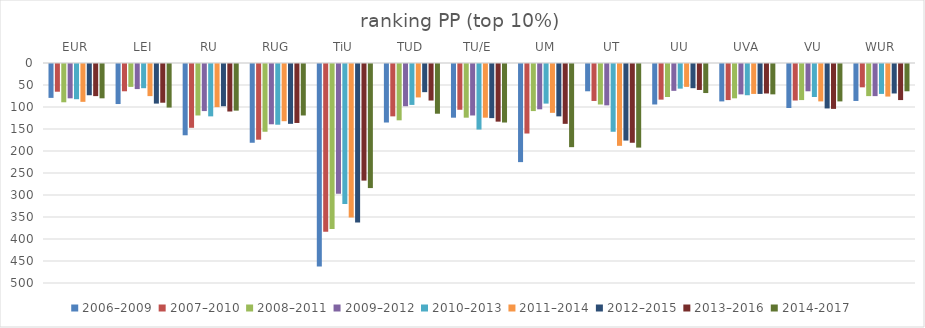
| Category | 2006–2009 | 2007–2010 | 2008–2011 | 2009–2012 | 2010–2013 | 2011–2014 | 2012–2015 | 2013–2016 | 2014-2017 |
|---|---|---|---|---|---|---|---|---|---|
| EUR | 77 | 63 | 87 | 78 | 80 | 86 | 71 | 73 | 78 |
| LEI | 91 | 62 | 52 | 57 | 55 | 73 | 90 | 88 | 99 |
| RU | 162 | 145 | 117 | 107 | 119 | 98 | 96 | 108 | 106 |
| RUG | 179 | 172 | 154 | 137 | 138 | 130 | 136 | 134 | 117 |
| TiU | 460 | 381 | 375 | 295 | 318 | 349 | 360 | 265 | 282 |
| TUD | 133 | 119 | 128 | 96 | 93 | 76 | 64 | 83 | 113 |
| TU/E | 122 | 104 | 122 | 117 | 149 | 122 | 123 | 131 | 133 |
| UM | 223 | 158 | 107 | 103 | 90 | 111 | 119 | 136 | 189 |
| UT | 62 | 84 | 92 | 94 | 154 | 186 | 174 | 179 | 190 |
| UU | 92 | 81 | 75 | 61 | 56 | 52 | 55 | 59 | 66 |
| UVA | 85 | 82 | 78 | 69 | 71 | 68 | 68 | 67 | 69 |
| VU | 100 | 83 | 82 | 62 | 75 | 85 | 101 | 102 | 85 |
| WUR | 84 | 53 | 73 | 73 | 68 | 74 | 67 | 82 | 62 |